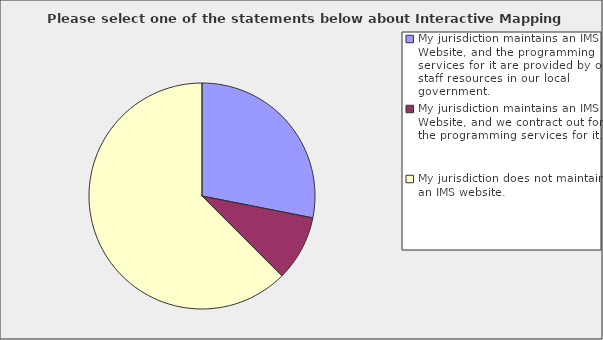
| Category | Series 0 |
|---|---|
| My jurisdiction maintains an IMS Website, and the programming services for it are provided by our staff resources in our local government. | 0.281 |
| My jurisdiction maintains an IMS Website, and we contract out for the programming services for it. | 0.094 |
| My jurisdiction does not maintain an IMS website. | 0.625 |